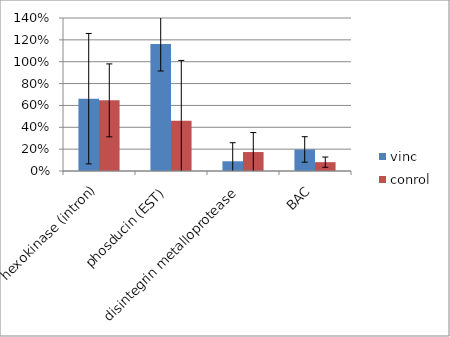
| Category | vinc | conrol |
|---|---|---|
| hexokinase (intron) | 0.662 | 0.646 |
| phosducin (EST) | 1.161 | 0.46 |
| disintegrin metalloprotease | 0.089 | 0.174 |
| BAC | 0.197 | 0.081 |